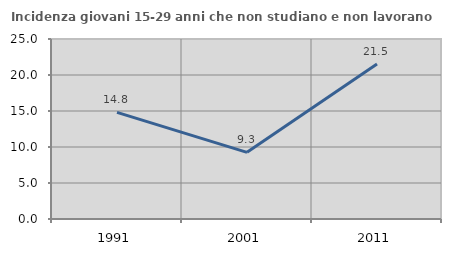
| Category | Incidenza giovani 15-29 anni che non studiano e non lavorano  |
|---|---|
| 1991.0 | 14.801 |
| 2001.0 | 9.259 |
| 2011.0 | 21.525 |